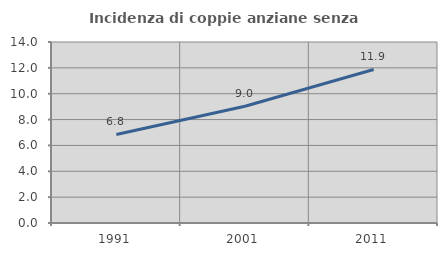
| Category | Incidenza di coppie anziane senza figli  |
|---|---|
| 1991.0 | 6.848 |
| 2001.0 | 9.035 |
| 2011.0 | 11.878 |